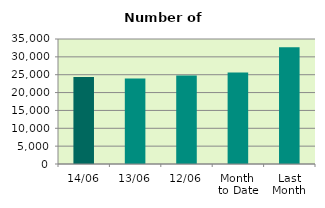
| Category | Series 0 |
|---|---|
| 14/06 | 24378 |
| 13/06 | 23928 |
| 12/06 | 24768 |
| Month 
to Date | 25606.2 |
| Last
Month | 32723.818 |